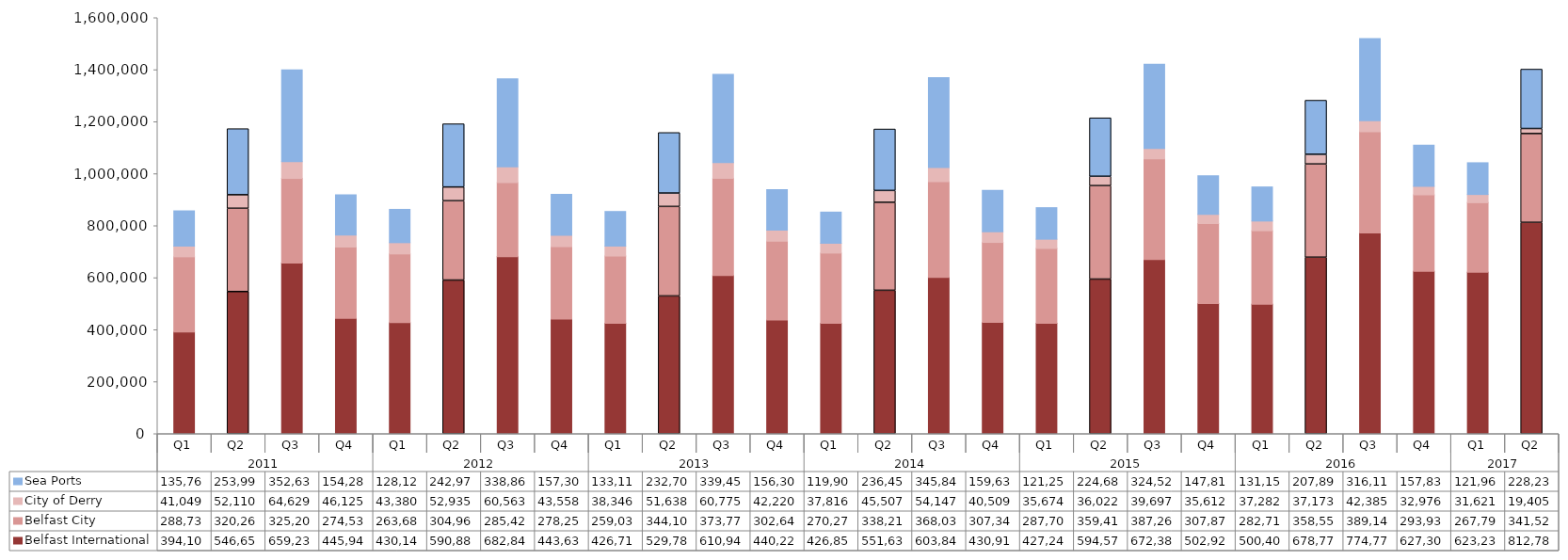
| Category | Belfast International  | Belfast City  | City of Derry | Sea Ports  |
|---|---|---|---|---|
| 0 | 394100 | 288733 | 41049 | 135765 |
| 1 | 546651 | 320268 | 52110 | 253996 |
| 2 | 659236 | 325208 | 64629 | 352634 |
| 3 | 445944 | 274534 | 46125 | 154289 |
| 4 | 430140 | 263681 | 43380 | 128126 |
| 5 | 590889 | 304966 | 52935 | 242979 |
| 6 | 682848 | 285428 | 60563 | 338862 |
| 7 | 443634 | 278255 | 43558 | 157300 |
| 8 | 426712 | 259035 | 38346 | 133115 |
| 9 | 529784 | 344108 | 51638 | 232700 |
| 10 | 610949 | 373771 | 60775 | 339454 |
| 11 | 440220 | 302642 | 42220 | 156301 |
| 12 | 426851 | 270276 | 37816 | 119908 |
| 13 | 551638 | 338216 | 45507 | 236452 |
| 14 | 603845 | 368032 | 54147 | 345849 |
| 15 | 430917 | 307349 | 40509 | 159639 |
| 16 | 427248 | 287709 | 35674 | 121250 |
| 17 | 594579 | 359411 | 36022 | 224689 |
| 18 | 672387 | 387267 | 39697 | 324526 |
| 19 | 502921 | 307873 | 35612 | 147811 |
| 20 | 500402 | 282712 | 37282 | 131151 |
| 21 | 678774 | 358552 | 37173 | 207894 |
| 22 | 774778 | 389141 | 42385 | 316118 |
| 23 | 627303 | 293936 | 32976 | 157838 |
| 24 | 623232 | 267795 | 31621 | 121961 |
| 25 | 812782 | 341528 | 19405 | 228238 |